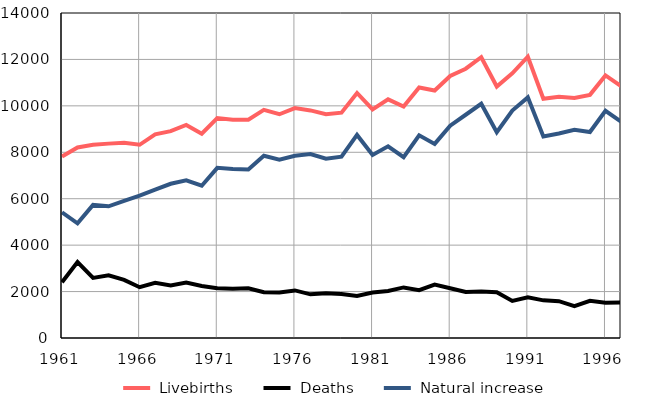
| Category |  Livebirths |  Deaths |  Natural increase |
|---|---|---|---|
| 1961.0 | 7814 | 2400 | 5414 |
| 1962.0 | 8210 | 3269 | 4941 |
| 1963.0 | 8325 | 2591 | 5734 |
| 1964.0 | 8373 | 2701 | 5672 |
| 1965.0 | 8415 | 2505 | 5910 |
| 1966.0 | 8323 | 2189 | 6134 |
| 1967.0 | 8773 | 2378 | 6395 |
| 1968.0 | 8910 | 2266 | 6644 |
| 1969.0 | 9180 | 2387 | 6793 |
| 1970.0 | 8798 | 2240 | 6558 |
| 1971.0 | 9475 | 2145 | 7330 |
| 1972.0 | 9403 | 2126 | 7277 |
| 1973.0 | 9403 | 2142 | 7261 |
| 1974.0 | 9825 | 1974 | 7851 |
| 1975.0 | 9639 | 1956 | 7683 |
| 1976.0 | 9902 | 2050 | 7852 |
| 1977.0 | 9804 | 1880 | 7924 |
| 1978.0 | 9644 | 1923 | 7721 |
| 1979.0 | 9707 | 1899 | 7808 |
| 1980.0 | 10556 | 1809 | 8747 |
| 1981.0 | 9844 | 1956 | 7888 |
| 1982.0 | 10281 | 2023 | 8258 |
| 1983.0 | 9970 | 2179 | 7791 |
| 1984.0 | 10792 | 2063 | 8729 |
| 1985.0 | 10660 | 2299 | 8361 |
| 1986.0 | 11289 | 2143 | 9146 |
| 1987.0 | 11601 | 1984 | 9617 |
| 1988.0 | 12096 | 2007 | 10089 |
| 1989.0 | 10833 | 1969 | 8864 |
| 1990.0 | 11399 | 1599 | 9800 |
| 1991.0 | 12118 | 1753 | 10365 |
| 1992.0 | 10304 | 1621 | 8683 |
| 1993.0 | 10396 | 1585 | 8811 |
| 1994.0 | 10338 | 1372 | 8966 |
| 1995.0 | 10474 | 1601 | 8873 |
| 1996.0 | 11309 | 1522 | 9787 |
| 1997.0 | 10848 | 1529 | 9319 |